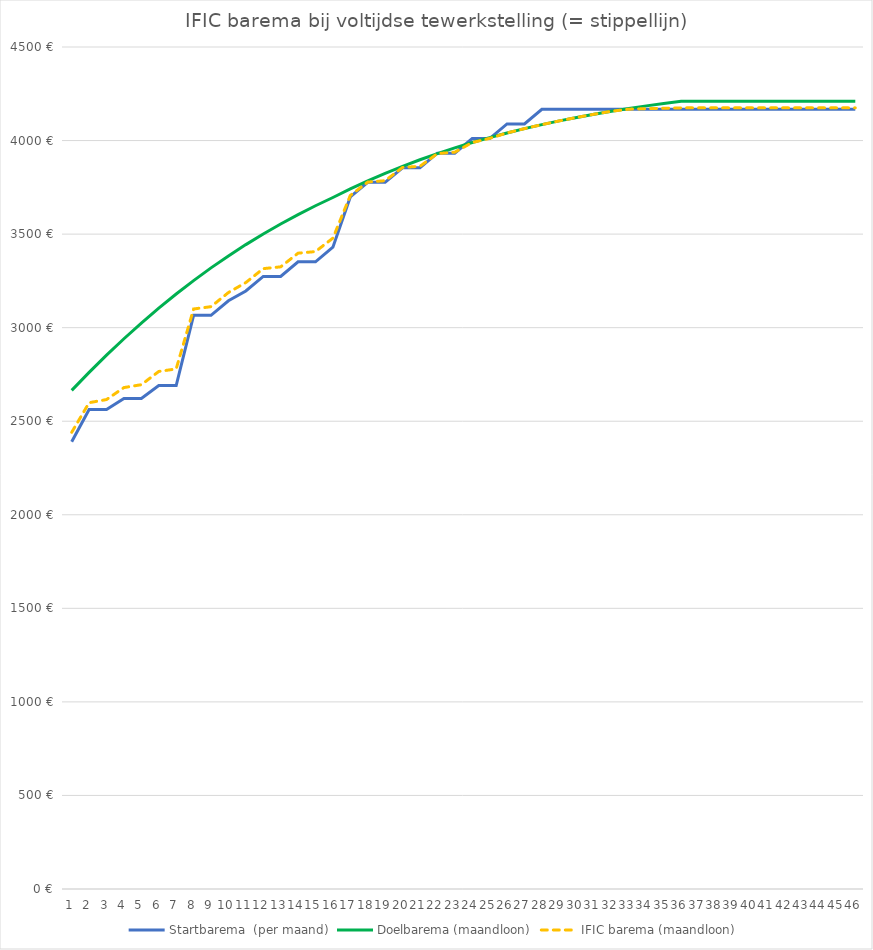
| Category | Startbarema  | Doelbarema | IFIC barema |
|---|---|---|---|
| 0 | 2390.71 | 2665.01 | 2440.77 |
| 1 | 2562.87 | 2760.95 | 2599.02 |
| 2 | 2562.87 | 2852.89 | 2615.8 |
| 3 | 2621.67 | 2940.76 | 2679.9 |
| 4 | 2621.67 | 3024.56 | 2695.2 |
| 5 | 2690.27 | 3104.27 | 2765.83 |
| 6 | 2690.27 | 3179.94 | 2779.63 |
| 7 | 3065.95 | 3251.65 | 3099.84 |
| 8 | 3065.95 | 3319.48 | 3112.22 |
| 9 | 3143.97 | 3383.52 | 3187.69 |
| 10 | 3195.97 | 3443.92 | 3241.22 |
| 11 | 3273.99 | 3500.77 | 3315.38 |
| 12 | 3273.99 | 3554.23 | 3325.13 |
| 13 | 3352 | 3604.44 | 3398.07 |
| 14 | 3352 | 3651.53 | 3406.66 |
| 15 | 3430.02 | 3695.66 | 3478.5 |
| 16 | 3698.75 | 3741.57 | 3706.56 |
| 17 | 3776.77 | 3784.56 | 3778.19 |
| 18 | 3776.77 | 3824.79 | 3785.53 |
| 19 | 3854.78 | 3862.38 | 3856.17 |
| 20 | 3854.78 | 3897.51 | 3862.58 |
| 21 | 3932.8 | 3930.29 | 3930.29 |
| 22 | 3932.8 | 3960.88 | 3937.92 |
| 23 | 4010.82 | 3989.38 | 3989.38 |
| 24 | 4010.82 | 4015.94 | 4011.75 |
| 25 | 4088.83 | 4040.68 | 4040.68 |
| 26 | 4088.83 | 4063.7 | 4063.7 |
| 27 | 4166.85 | 4085.11 | 4085.11 |
| 28 | 4166.85 | 4105.02 | 4105.02 |
| 29 | 4166.85 | 4123.52 | 4123.52 |
| 30 | 4166.85 | 4140.72 | 4140.72 |
| 31 | 4166.85 | 4156.69 | 4156.69 |
| 32 | 4166.85 | 4171.52 | 4167.7 |
| 33 | 4166.85 | 4185.29 | 4170.22 |
| 34 | 4166.85 | 4198.08 | 4172.55 |
| 35 | 4166.85 | 4209.93 | 4174.71 |
| 36 | 4166.85 | 4209.93 | 4174.71 |
| 37 | 4166.85 | 4209.93 | 4174.71 |
| 38 | 4166.85 | 4209.93 | 4174.71 |
| 39 | 4166.85 | 4209.93 | 4174.71 |
| 40 | 4166.85 | 4209.93 | 4174.71 |
| 41 | 4166.85 | 4209.93 | 4174.71 |
| 42 | 4166.85 | 4209.93 | 4174.71 |
| 43 | 4166.85 | 4209.93 | 4174.71 |
| 44 | 4166.85 | 4209.93 | 4174.71 |
| 45 | 4166.85 | 4209.93 | 4174.71 |